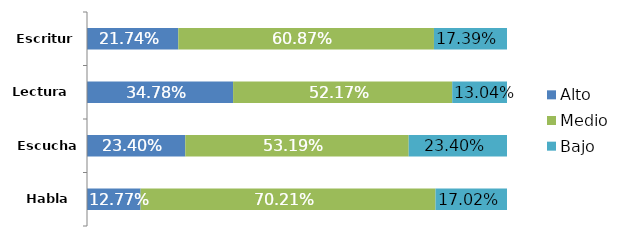
| Category | Alto | Medio | Bajo |
|---|---|---|---|
| Habla | 0.128 | 0.702 | 0.17 |
| Escucha | 0.234 | 0.532 | 0.234 |
| Lectura | 0.348 | 0.522 | 0.13 |
| Escritura | 0.217 | 0.609 | 0.174 |